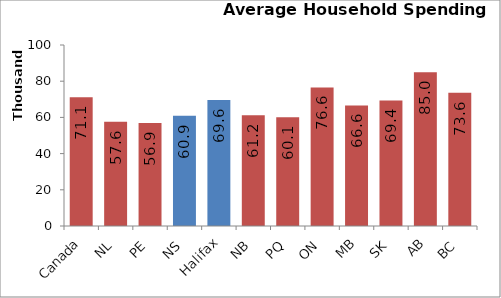
| Category | Average Household Spending 2009 |
|---|---|
| Canada | 71117 |
| NL | 57605 |
| PE | 56896 |
| NS | 60867 |
| Halifax | 69550 |
| NB | 61212 |
| PQ | 60125 |
| ON | 76577 |
| MB | 66608 |
| SK | 69377 |
| AB | 84976 |
| BC | 73571 |